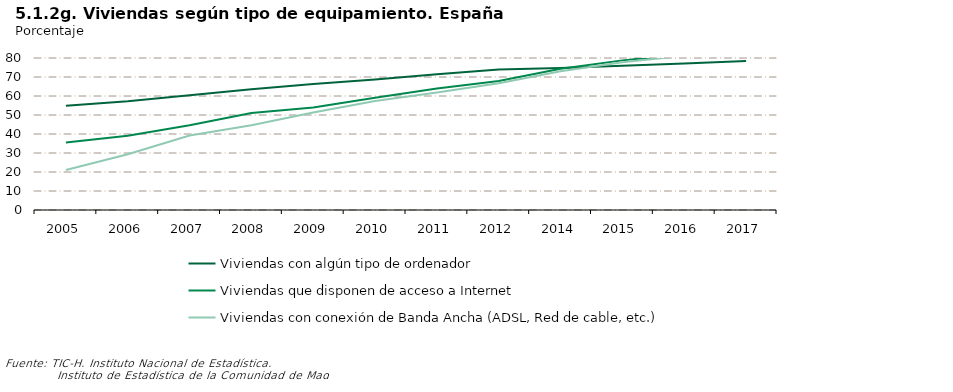
| Category | Viviendas con algún tipo de ordenador | Viviendas que disponen de acceso a Internet | Viviendas con conexión de Banda Ancha (ADSL, Red de cable, etc.) |
|---|---|---|---|
| 2005.0 | 54.9 | 35.5 | 21.1 |
| 2006.0 | 57.2 | 39.1 | 29.3 |
| 2007.0 | 60.4 | 44.6 | 39.2 |
| 2008.0 | 63.6 | 51 | 44.6 |
| 2009.0 | 66.3 | 54 | 51.3 |
| 2010.0 | 68.7 | 59.1 | 57.4 |
| 2011.0 | 71.5 | 63.9 | 61.9 |
| 2012.0 | 73.915 | 67.867 | 66.732 |
| 2014.0 | 74.778 | 74.355 | 73.015 |
| 2015.0 | 75.865 | 78.749 | 77.821 |
| 2016.0 | 77.076 | 81.931 | 81.155 |
| 2017.0 | 78.385 | 83.386 | 82.683 |